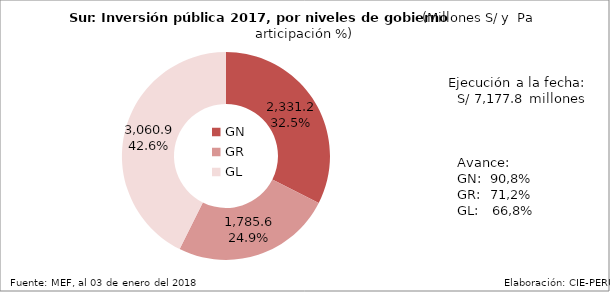
| Category | Ejecutado |
|---|---|
| GN | 2331.203 |
| GR | 1785.63 |
| GL | 3060.93 |